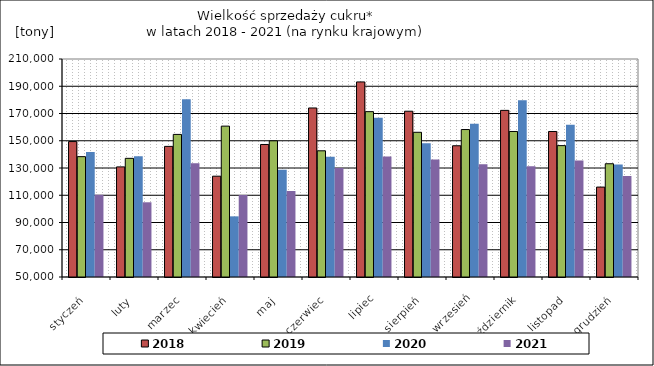
| Category | 2018 | 2019 | 2020 | 2021 |
|---|---|---|---|---|
| styczeń | 149394.09 | 138330.31 | 141767.42 | 110331.21 |
| luty | 130822.53 | 137095.49 | 138656.7 | 104835.03 |
| marzec | 145863.79 | 154647.44 | 180503.53 | 133538.12 |
| kwiecień | 123979.52 | 160722.77 | 94521.89 | 110198.71 |
| maj | 147269.63 | 149962.12 | 128649.9 | 113196.52 |
| czerwiec | 174058.88 | 142617.98 | 138269.79 | 130080.48 |
| lipiec | 193169.88 | 171364.62 | 166919 | 138412.45 |
| sierpień | 171663.7 | 156211.56 | 148210.3 | 136277.82 |
| wrzesień | 146323.5 | 158226.28 | 162524.88 | 132720.8 |
| październik | 172295.67 | 156804.33 | 179757.04 | 131333.61 |
| listopad | 156790.45 | 146432.58 | 161724.7 | 135553.82 |
| grudzień | 115997.05 | 133122.03 | 132594.64 | 124038.22 |